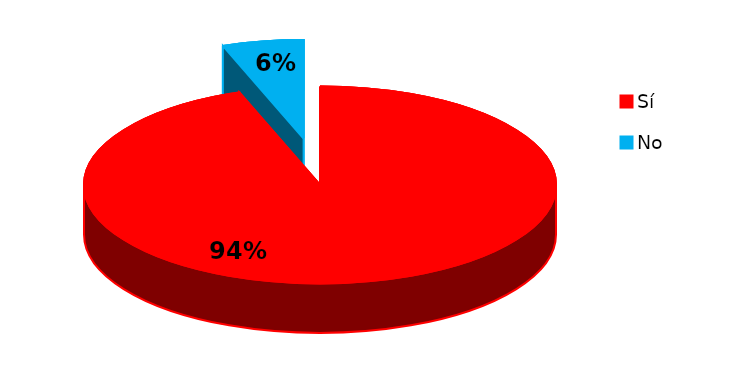
| Category | Series 0 |
|---|---|
| 0 | 34 |
| 1 | 2 |